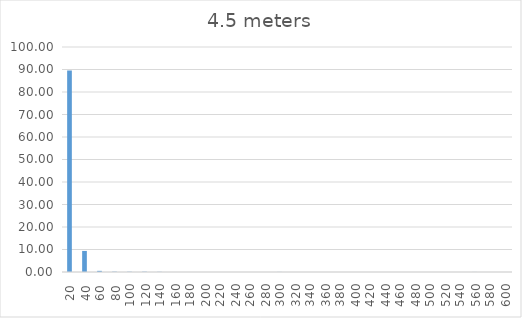
| Category | Series 0 |
|---|---|
| 20.0 | 89.527 |
| 40.0 | 9.361 |
| 60.0 | 0.511 |
| 80.0 | 0.141 |
| 100.0 | 0.115 |
| 120.0 | 0.128 |
| 140.0 | 0.077 |
| 160.0 | 0.013 |
| 180.0 | 0.013 |
| 200.0 | 0 |
| 220.0 | 0 |
| 240.0 | 0 |
| 260.0 | 0.013 |
| 280.0 | 0 |
| 300.0 | 0.038 |
| 320.0 | 0 |
| 340.0 | 0 |
| 360.0 | 0 |
| 380.0 | 0.013 |
| 400.0 | 0.013 |
| 420.0 | 0 |
| 440.0 | 0 |
| 460.0 | 0 |
| 480.0 | 0 |
| 500.0 | 0 |
| 520.0 | 0.013 |
| 540.0 | 0 |
| 560.0 | 0.026 |
| 580.0 | 0 |
| 600.0 | 0 |